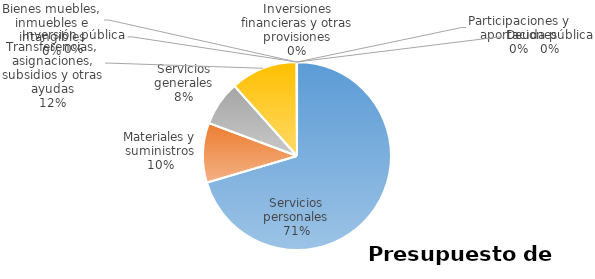
| Category | Series 0 | Series 1 | Series 2 | Series 3 | Series 4 | Series 5 |
|---|---|---|---|---|---|---|
| Servicios personales | 43967375 |  |  |  |  |  |
| Materiales y suministros | 6410000 |  |  |  |  |  |
| Servicios generales | 4801894 |  |  |  |  |  |
| Transferencias, asignaciones, subsidios y otras ayudas | 7203440 |  |  |  |  |  |
| Bienes muebles, inmuebles e intangibles | 50000 |  |  |  |  |  |
| Inversión pública | 0 |  |  |  |  |  |
| Inversiones financieras y otras provisiones | 0 |  |  |  |  |  |
| Participaciones y aportaciones | 0 |  |  |  |  |  |
| Deuda pública | 0 |  |  |  |  |  |